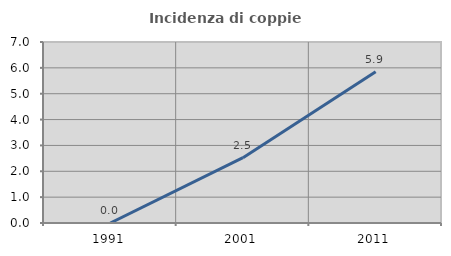
| Category | Incidenza di coppie miste |
|---|---|
| 1991.0 | 0 |
| 2001.0 | 2.525 |
| 2011.0 | 5.854 |